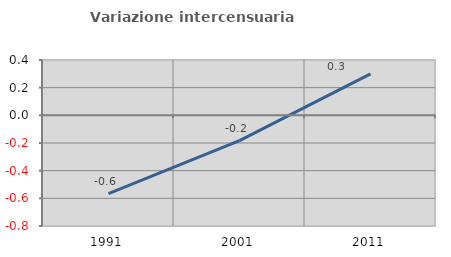
| Category | Variazione intercensuaria annua |
|---|---|
| 1991.0 | -0.567 |
| 2001.0 | -0.183 |
| 2011.0 | 0.3 |